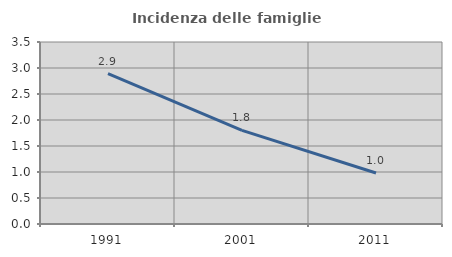
| Category | Incidenza delle famiglie numerose |
|---|---|
| 1991.0 | 2.89 |
| 2001.0 | 1.802 |
| 2011.0 | 0.98 |